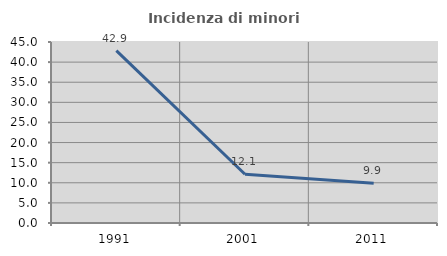
| Category | Incidenza di minori stranieri |
|---|---|
| 1991.0 | 42.857 |
| 2001.0 | 12.121 |
| 2011.0 | 9.89 |